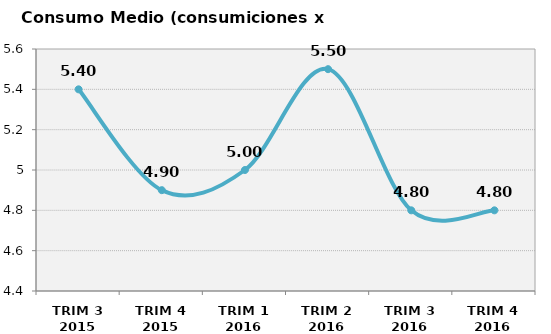
| Category | Consumo Medio (consumiciones x indiv) |
|---|---|
| TRIM 3 2015 | 5.4 |
| TRIM 4 2015 | 4.9 |
| TRIM 1 2016 | 5 |
| TRIM 2 2016 | 5.5 |
| TRIM 3 2016 | 4.8 |
| TRIM 4 2016 | 4.8 |